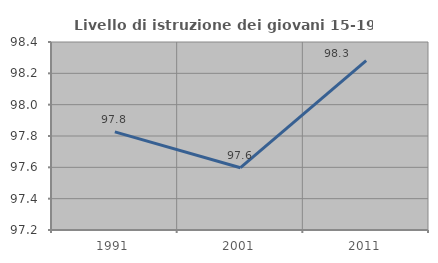
| Category | Livello di istruzione dei giovani 15-19 anni |
|---|---|
| 1991.0 | 97.826 |
| 2001.0 | 97.598 |
| 2011.0 | 98.281 |